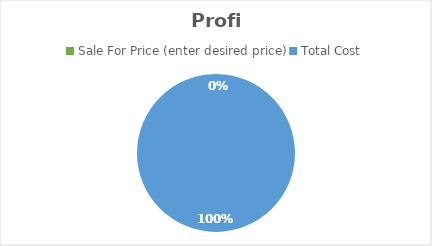
| Category | Series 0 |
|---|---|
| Sale For Price (enter desired price) | 0 |
| Total Cost | 17.628 |